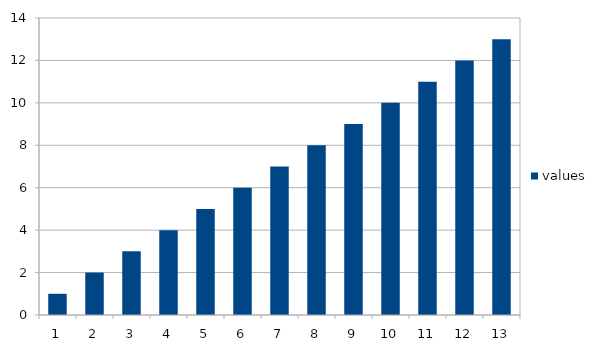
| Category | values |
|---|---|
| 0 | 1 |
| 1 | 2 |
| 2 | 3 |
| 3 | 4 |
| 4 | 5 |
| 5 | 6 |
| 6 | 7 |
| 7 | 8 |
| 8 | 9 |
| 9 | 10 |
| 10 | 11 |
| 11 | 12 |
| 12 | 13 |